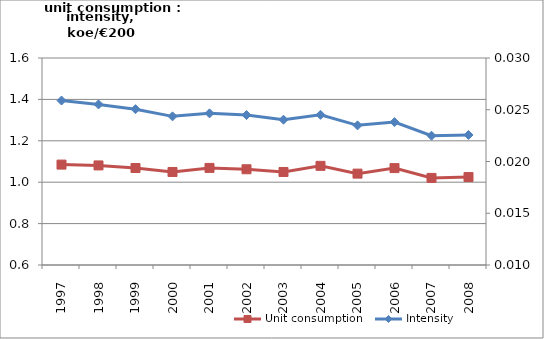
| Category | Unit consumption |
|---|---|
| 1997.0 | 1.085 |
| 1998.0 | 1.081 |
| 1999.0 | 1.069 |
| 2000.0 | 1.049 |
| 2001.0 | 1.069 |
| 2002.0 | 1.063 |
| 2003.0 | 1.049 |
| 2004.0 | 1.079 |
| 2005.0 | 1.041 |
| 2006.0 | 1.068 |
| 2007.0 | 1.021 |
| 2008.0 | 1.025 |